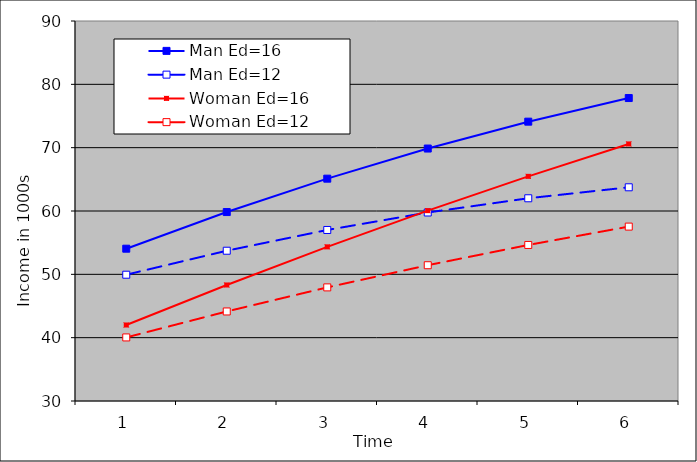
| Category | Man Ed=16 | Man Ed=12 | Woman Ed=16 | Woman Ed=12 |
|---|---|---|---|---|
| 0 | 54.049 | 49.939 | 42 | 40.037 |
| 1 | 59.834 | 53.728 | 48.319 | 44.138 |
| 2 | 65.106 | 57.003 | 54.337 | 47.938 |
| 3 | 69.863 | 59.763 | 60.055 | 51.438 |
| 4 | 74.106 | 62.01 | 65.472 | 54.637 |
| 5 | 77.835 | 63.743 | 70.588 | 57.536 |